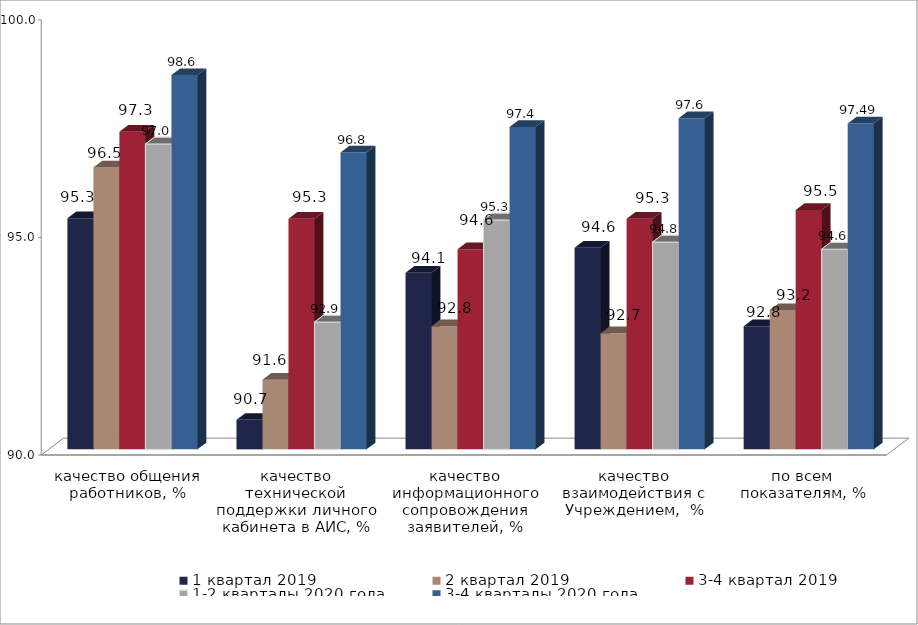
| Category | 1 квартал 2019 | 2 квартал 2019 | 3-4 квартал 2019 | 1-2 кварталы 2020 года | 3-4 кварталы 2020 года |
|---|---|---|---|---|---|
| качество общения работников, % | 95.309 | 96.48 | 97.3 | 97.018 | 98.6 |
| качество технической поддержки личного кабинета в АИС, % | 90.678 | 91.6 | 95.3 | 92.926 | 96.82 |
| качество информационного сопровождения заявителей, % | 94.057 | 92.83 | 94.6 | 95.273 | 97.41 |
| качество взаимодействия с Учреждением,  % | 94.631 | 92.67 | 95.3 | 94.764 | 97.61 |
| по всем показателям, % | 92.828 | 93.2 | 95.5 | 94.6 | 97.49 |